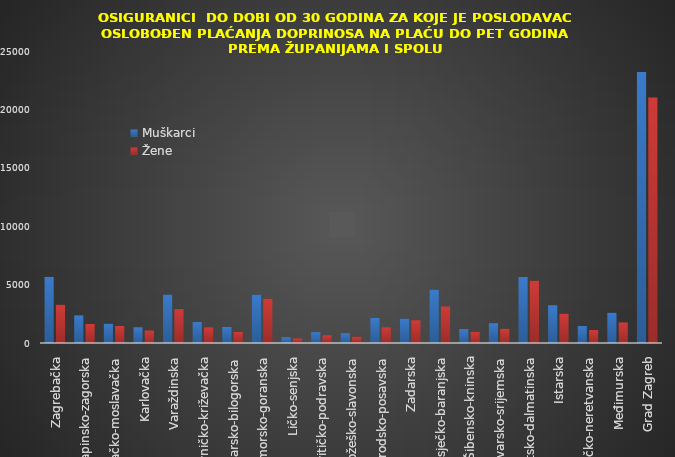
| Category | Muškarci | Žene |
|---|---|---|
| Zagrebačka | 5657 | 3279 |
| Krapinsko-zagorska | 2366 | 1625 |
| Sisačko-moslavačka | 1652 | 1460 |
| Karlovačka | 1351 | 1072 |
| Varaždinska | 4147 | 2895 |
| Koprivničko-križevačka | 1794 | 1339 |
| Bjelovarsko-bilogorska | 1383 | 953 |
| Primorsko-goranska | 4142 | 3802 |
| Ličko-senjska | 502 | 392 |
| Virovitičko-podravska | 931 | 661 |
| Požeško-slavonska | 837 | 542 |
| Brodsko-posavska | 2139 | 1342 |
| Zadarska | 2091 | 1948 |
| Osječko-baranjska | 4568 | 3130 |
| Šibensko-kninska | 1193 | 953 |
| Vukovarsko-srijemska | 1695 | 1219 |
| Splitsko-dalmatinska | 5651 | 5336 |
| Istarska | 3234 | 2521 |
| Dubrovačko-neretvanska | 1448 | 1113 |
| Međimurska | 2588 | 1759 |
| Grad Zagreb | 23204 | 21023 |